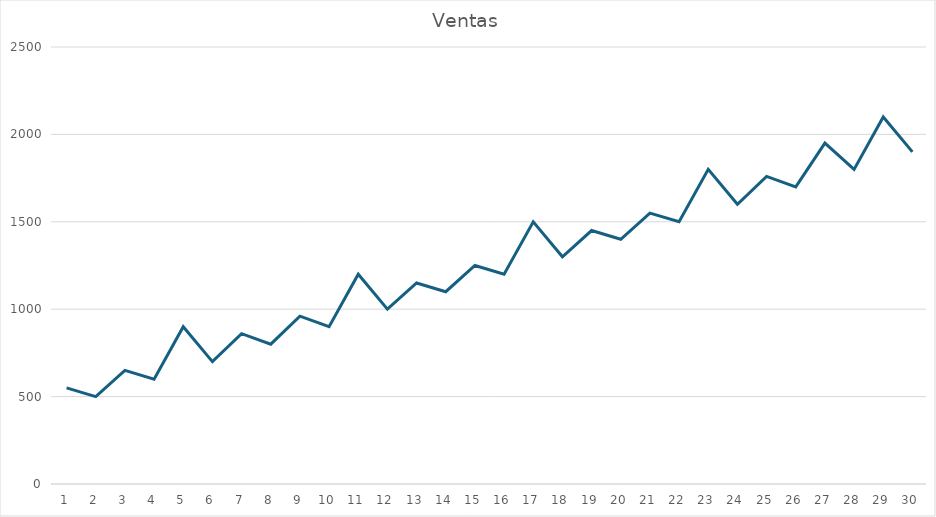
| Category | Ventas |
|---|---|
| 0 | 550 |
| 1 | 500 |
| 2 | 650 |
| 3 | 600 |
| 4 | 900 |
| 5 | 700 |
| 6 | 860 |
| 7 | 800 |
| 8 | 960 |
| 9 | 900 |
| 10 | 1200 |
| 11 | 1000 |
| 12 | 1150 |
| 13 | 1100 |
| 14 | 1250 |
| 15 | 1200 |
| 16 | 1500 |
| 17 | 1300 |
| 18 | 1450 |
| 19 | 1400 |
| 20 | 1550 |
| 21 | 1500 |
| 22 | 1800 |
| 23 | 1600 |
| 24 | 1760 |
| 25 | 1700 |
| 26 | 1950 |
| 27 | 1800 |
| 28 | 2100 |
| 29 | 1900 |